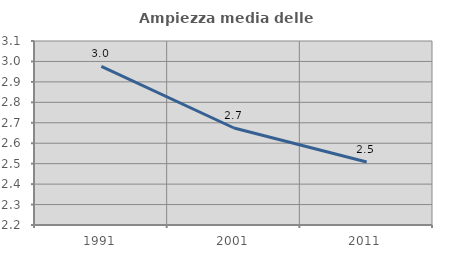
| Category | Ampiezza media delle famiglie |
|---|---|
| 1991.0 | 2.976 |
| 2001.0 | 2.674 |
| 2011.0 | 2.508 |